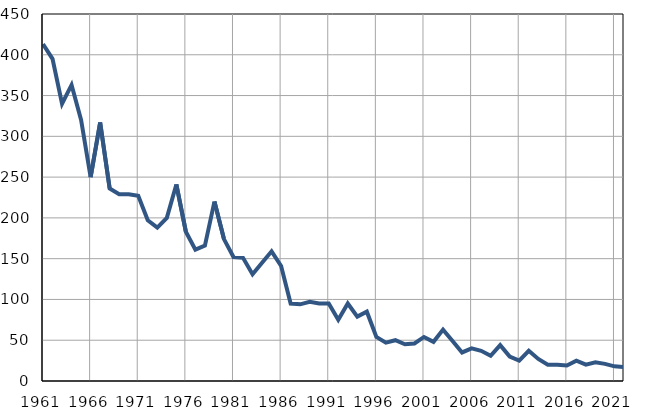
| Category | Infants
deaths |
|---|---|
| 1961.0 | 413 |
| 1962.0 | 395 |
| 1963.0 | 340 |
| 1964.0 | 363 |
| 1965.0 | 320 |
| 1966.0 | 250 |
| 1967.0 | 317 |
| 1968.0 | 236 |
| 1969.0 | 229 |
| 1970.0 | 229 |
| 1971.0 | 227 |
| 1972.0 | 197 |
| 1973.0 | 188 |
| 1974.0 | 200 |
| 1975.0 | 241 |
| 1976.0 | 183 |
| 1977.0 | 161 |
| 1978.0 | 166 |
| 1979.0 | 220 |
| 1980.0 | 174 |
| 1981.0 | 152 |
| 1982.0 | 151 |
| 1983.0 | 131 |
| 1984.0 | 145 |
| 1985.0 | 159 |
| 1986.0 | 141 |
| 1987.0 | 95 |
| 1988.0 | 94 |
| 1989.0 | 97 |
| 1990.0 | 95 |
| 1991.0 | 95 |
| 1992.0 | 75 |
| 1993.0 | 95 |
| 1994.0 | 79 |
| 1995.0 | 85 |
| 1996.0 | 54 |
| 1997.0 | 47 |
| 1998.0 | 50 |
| 1999.0 | 45 |
| 2000.0 | 46 |
| 2001.0 | 54 |
| 2002.0 | 48 |
| 2003.0 | 63 |
| 2004.0 | 49 |
| 2005.0 | 35 |
| 2006.0 | 40 |
| 2007.0 | 37 |
| 2008.0 | 31 |
| 2009.0 | 44 |
| 2010.0 | 30 |
| 2011.0 | 25 |
| 2012.0 | 37 |
| 2013.0 | 27 |
| 2014.0 | 20 |
| 2015.0 | 20 |
| 2016.0 | 19 |
| 2017.0 | 25 |
| 2018.0 | 20 |
| 2019.0 | 23 |
| 2020.0 | 21 |
| 2021.0 | 18 |
| 2022.0 | 17 |